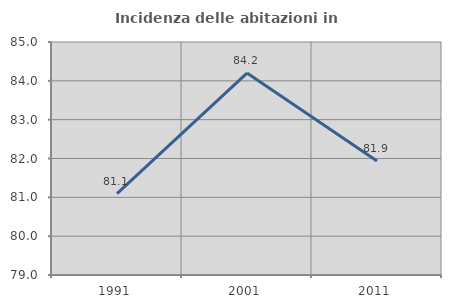
| Category | Incidenza delle abitazioni in proprietà  |
|---|---|
| 1991.0 | 81.096 |
| 2001.0 | 84.2 |
| 2011.0 | 81.938 |